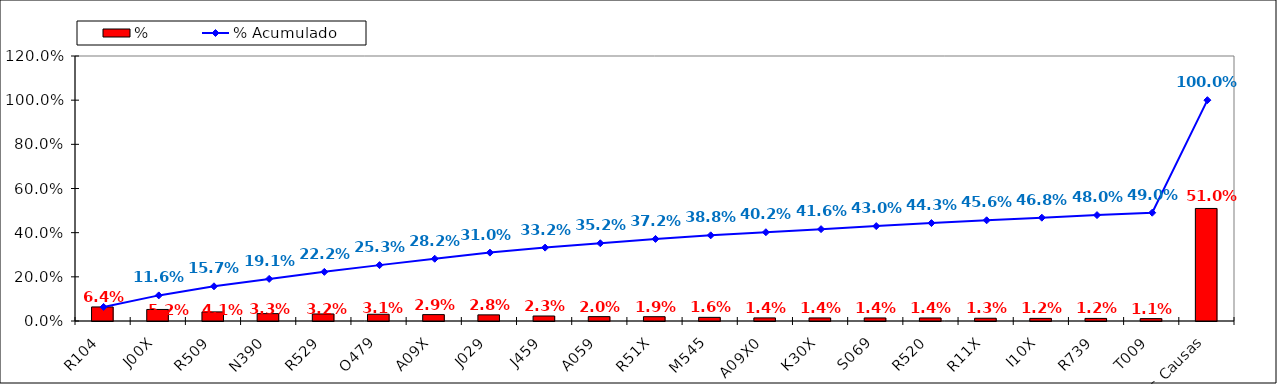
| Category | % |
|---|---|
| R104 | 0.064 |
| J00X | 0.052 |
| R509 | 0.041 |
| N390 | 0.033 |
| R529 | 0.032 |
| O479 | 0.031 |
| A09X | 0.029 |
| J029 | 0.028 |
| J459 | 0.023 |
| A059 | 0.02 |
| R51X | 0.019 |
| M545 | 0.016 |
| A09X0 | 0.014 |
| K30X | 0.014 |
| S069 | 0.014 |
| R520 | 0.014 |
| R11X | 0.013 |
| I10X | 0.012 |
| R739 | 0.012 |
| T009 | 0.011 |
| Otras Causas | 0.51 |